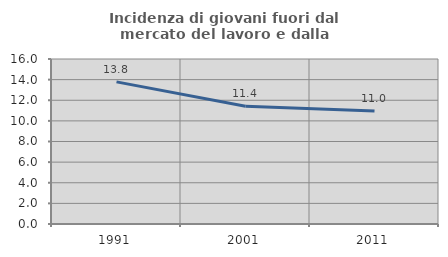
| Category | Incidenza di giovani fuori dal mercato del lavoro e dalla formazione  |
|---|---|
| 1991.0 | 13.782 |
| 2001.0 | 11.426 |
| 2011.0 | 10.961 |